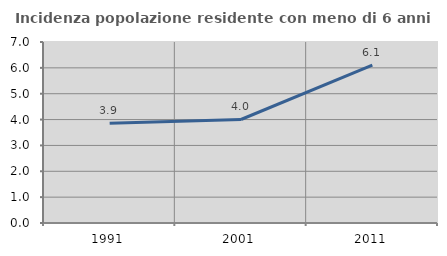
| Category | Incidenza popolazione residente con meno di 6 anni |
|---|---|
| 1991.0 | 3.86 |
| 2001.0 | 4.003 |
| 2011.0 | 6.103 |